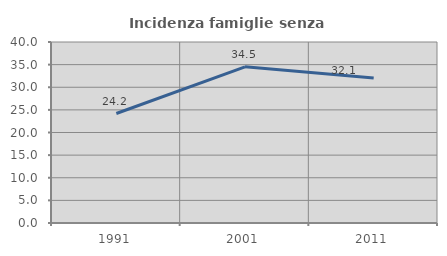
| Category | Incidenza famiglie senza nuclei |
|---|---|
| 1991.0 | 24.194 |
| 2001.0 | 34.51 |
| 2011.0 | 32.068 |